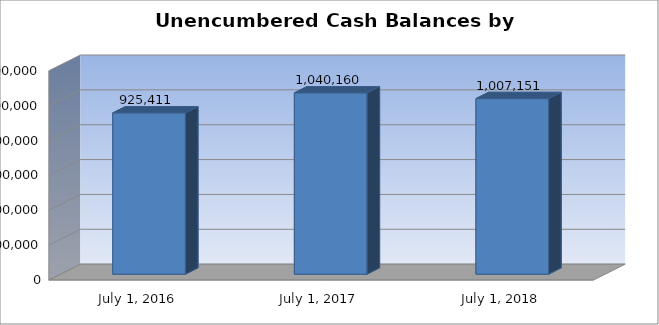
| Category | Unencumbered Cash Balances |
|---|---|
| July 1, 2016 | 925411 |
| July 1, 2017 | 1040160 |
| July 1, 2018 | 1007151 |